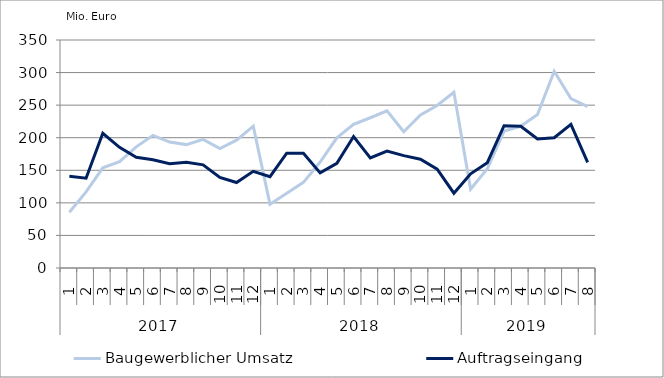
| Category | Baugewerblicher Umsatz | Auftragseingang |
|---|---|---|
| 0 | 85701.947 | 140751.008 |
| 1 | 116743.276 | 137863.383 |
| 2 | 153810.055 | 206710.579 |
| 3 | 163342.989 | 185183.797 |
| 4 | 185946.221 | 169878.51 |
| 5 | 203627.91 | 166148.392 |
| 6 | 193377.256 | 160134.206 |
| 7 | 189429.952 | 162221.206 |
| 8 | 197405.279 | 158305.285 |
| 9 | 183450.026 | 139156.761 |
| 10 | 196209.214 | 131165.419 |
| 11 | 217688.447 | 148434.901 |
| 12 | 97959.056 | 140119.385 |
| 13 | 114756.787 | 176330.213 |
| 14 | 131454.642 | 176241.061 |
| 15 | 162648.053 | 146063.407 |
| 16 | 199809.407 | 160551.931 |
| 17 | 220535.974 | 201835.846 |
| 18 | 230672.472 | 169132.23 |
| 19 | 241233.619 | 179396.293 |
| 20 | 209099.292 | 172542.764 |
| 21 | 234953.007 | 166991.729 |
| 22 | 249410.043 | 151835.629 |
| 23 | 269773.227 | 114807.456 |
| 24 | 120975.133 | 144510.881 |
| 25 | 152329.786 | 161685.201 |
| 26 | 210227.67 | 218455.879 |
| 27 | 217522.321 | 217610.064 |
| 28 | 235490.429 | 198110.439 |
| 29 | 301963.302 | 200012.086 |
| 30 | 259975.317 | 220559.061 |
| 31 | 247779.658 | 162059.723 |